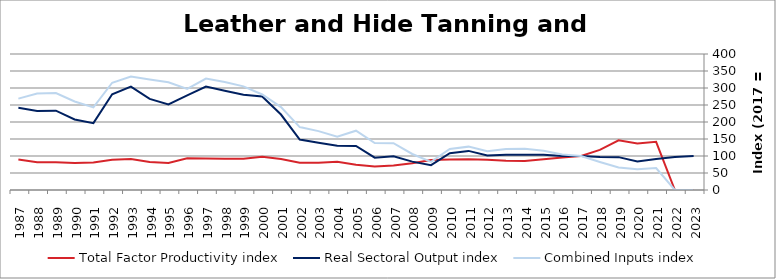
| Category | Total Factor Productivity index | Real Sectoral Output index | Combined Inputs index |
|---|---|---|---|
| 2023.0 | 0 | 99.794 | 0 |
| 2022.0 | 0 | 97.198 | 0 |
| 2021.0 | 141.782 | 91.423 | 64.482 |
| 2020.0 | 136.861 | 83.586 | 61.073 |
| 2019.0 | 146.057 | 96.681 | 66.195 |
| 2018.0 | 118.073 | 97.342 | 82.443 |
| 2017.0 | 100 | 100 | 100 |
| 2016.0 | 95.564 | 100.049 | 104.693 |
| 2015.0 | 90.207 | 103.917 | 115.199 |
| 2014.0 | 85.523 | 103.837 | 121.415 |
| 2013.0 | 86.044 | 103.835 | 120.677 |
| 2012.0 | 88.826 | 101.454 | 114.217 |
| 2011.0 | 90.164 | 114.999 | 127.545 |
| 2010.0 | 89.615 | 108.026 | 120.545 |
| 2009.0 | 88.208 | 73.008 | 82.768 |
| 2008.0 | 78.715 | 83.382 | 105.929 |
| 2007.0 | 71.947 | 98.986 | 137.581 |
| 2006.0 | 68.875 | 94.997 | 137.927 |
| 2005.0 | 74.372 | 129.745 | 174.453 |
| 2004.0 | 82.989 | 129.864 | 156.484 |
| 2003.0 | 80.073 | 138.684 | 173.197 |
| 2002.0 | 80.299 | 148.587 | 185.041 |
| 2001.0 | 91.066 | 221.971 | 243.748 |
| 2000.0 | 97.83 | 274.89 | 280.987 |
| 1999.0 | 91.915 | 280.134 | 304.775 |
| 1998.0 | 91.932 | 291.859 | 317.472 |
| 1997.0 | 92.742 | 304.046 | 327.842 |
| 1996.0 | 93.555 | 278.377 | 297.553 |
| 1995.0 | 79.406 | 251.68 | 316.955 |
| 1994.0 | 82.406 | 267.851 | 325.037 |
| 1993.0 | 91.125 | 304.058 | 333.672 |
| 1992.0 | 89.246 | 281.499 | 315.419 |
| 1991.0 | 80.98 | 196.665 | 242.856 |
| 1990.0 | 79.65 | 207.361 | 260.341 |
| 1989.0 | 81.749 | 233.213 | 285.28 |
| 1988.0 | 81.927 | 232.574 | 283.879 |
| 1987.0 | 89.92 | 241.603 | 268.688 |